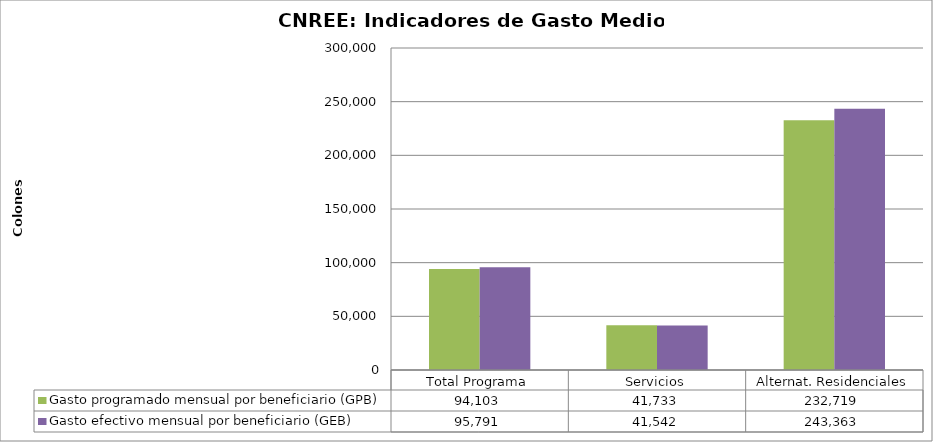
| Category | Gasto programado mensual por beneficiario (GPB)  | Gasto efectivo mensual por beneficiario (GEB)  |
|---|---|---|
| Total Programa | 94102.77 | 95791.044 |
| Servicios | 41733.021 | 41541.559 |
| Alternat. Residenciales | 232719.117 | 243363.234 |